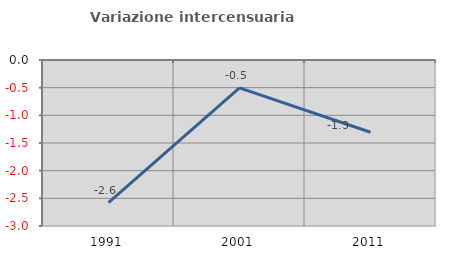
| Category | Variazione intercensuaria annua |
|---|---|
| 1991.0 | -2.577 |
| 2001.0 | -0.504 |
| 2011.0 | -1.306 |